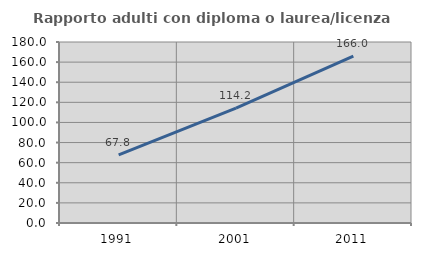
| Category | Rapporto adulti con diploma o laurea/licenza media  |
|---|---|
| 1991.0 | 67.776 |
| 2001.0 | 114.169 |
| 2011.0 | 166.049 |